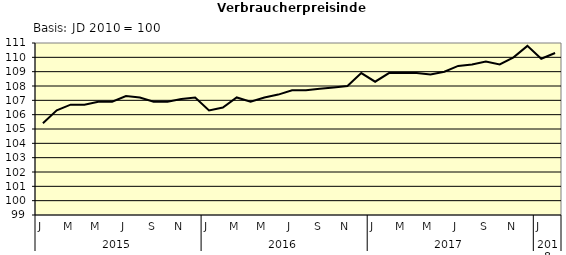
| Category | Series 0 |
|---|---|
| 0 | 105.4 |
| 1 | 106.3 |
| 2 | 106.7 |
| 3 | 106.7 |
| 4 | 106.9 |
| 5 | 106.9 |
| 6 | 107.3 |
| 7 | 107.2 |
| 8 | 106.9 |
| 9 | 106.9 |
| 10 | 107.1 |
| 11 | 107.2 |
| 12 | 106.3 |
| 13 | 106.5 |
| 14 | 107.2 |
| 15 | 106.9 |
| 16 | 107.2 |
| 17 | 107.4 |
| 18 | 107.7 |
| 19 | 107.7 |
| 20 | 107.8 |
| 21 | 107.9 |
| 22 | 108 |
| 23 | 108.9 |
| 24 | 108.3 |
| 25 | 108.9 |
| 26 | 108.9 |
| 27 | 108.9 |
| 28 | 108.8 |
| 29 | 109 |
| 30 | 109.4 |
| 31 | 109.5 |
| 32 | 109.7 |
| 33 | 109.5 |
| 34 | 110 |
| 35 | 110.8 |
| 36 | 109.9 |
| 37 | 110.3 |